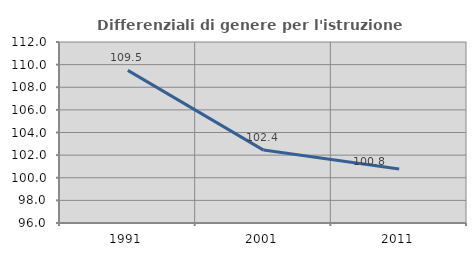
| Category | Differenziali di genere per l'istruzione superiore |
|---|---|
| 1991.0 | 109.49 |
| 2001.0 | 102.445 |
| 2011.0 | 100.775 |